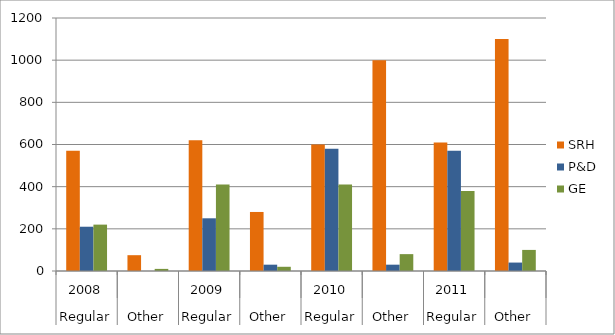
| Category | SRH | P&D | GE |
|---|---|---|---|
| 0 | 570 | 210 | 220 |
| 1 | 75 | 0 | 10 |
| 2 | 620 | 250 | 410 |
| 3 | 280 | 30 | 20 |
| 4 | 600 | 580 | 410 |
| 5 | 1000 | 30 | 80 |
| 6 | 610 | 570 | 380 |
| 7 | 1100 | 40 | 100 |